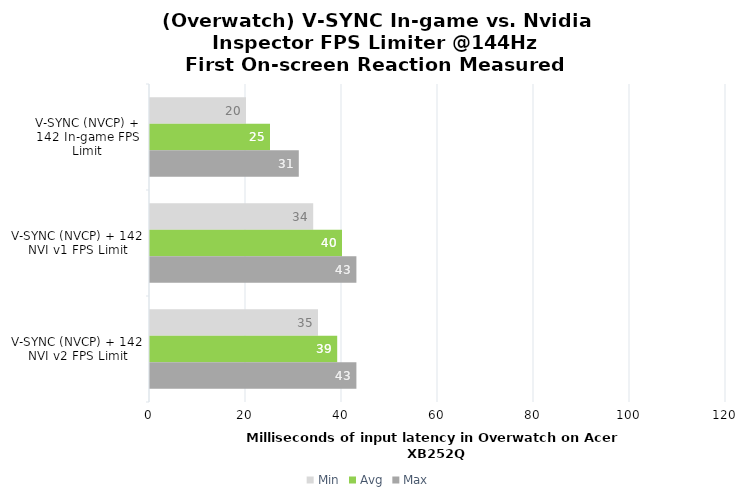
| Category | Min | Avg | Max |
|---|---|---|---|
| V-SYNC (NVCP) + 142 In-game FPS Limit | 20 | 25 | 31 |
| V-SYNC (NVCP) + 142 NVI v1 FPS Limit | 34 | 40 | 43 |
| V-SYNC (NVCP) + 142 NVI v2 FPS Limit | 35 | 39 | 43 |